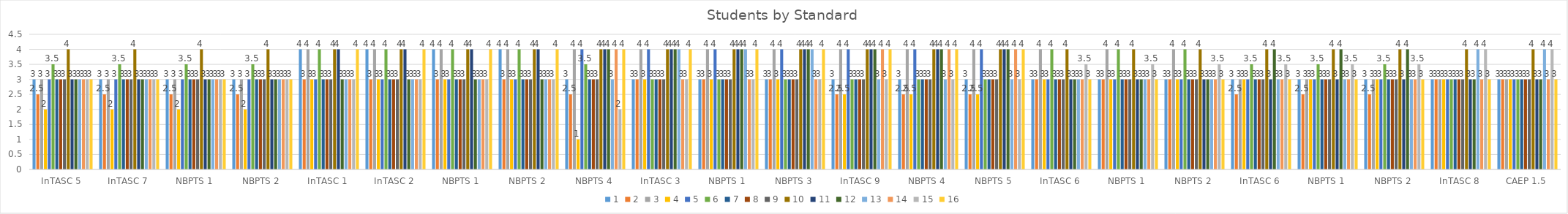
| Category | 1 | 2 | 3 | 4 | 5 | 6 | 7 | 8 | 9 | 10 | 11 | 12 | 13 | 14 | 15 | 16 |
|---|---|---|---|---|---|---|---|---|---|---|---|---|---|---|---|---|
| InTASC 5 | 3 | 2.5 | 3 | 2 | 3 | 3.5 | 3 | 3 | 3 | 4 | 3 | 3 | 3 | 3 | 3 | 3 |
| InTASC 7 | 3 | 2.5 | 3 | 2 | 3 | 3.5 | 3 | 3 | 3 | 4 | 3 | 3 | 3 | 3 | 3 | 3 |
| NBPTS 1 | 3 | 2.5 | 3 | 2 | 3 | 3.5 | 3 | 3 | 3 | 4 | 3 | 3 | 3 | 3 | 3 | 3 |
| NBPTS 2 | 3 | 2.5 | 3 | 2 | 3 | 3.5 | 3 | 3 | 3 | 4 | 3 | 3 | 3 | 3 | 3 | 3 |
| InTASC 1 | 4 | 3 | 4 | 3 | 3 | 4 | 3 | 3 | 3 | 4 | 4 | 3 | 3 | 3 | 3 | 4 |
| InTASC 2 | 4 | 3 | 4 | 3 | 3 | 4 | 3 | 3 | 3 | 4 | 4 | 3 | 3 | 3 | 3 | 4 |
| NBPTS 1 | 4 | 3 | 4 | 3 | 3 | 4 | 3 | 3 | 3 | 4 | 4 | 3 | 3 | 3 | 3 | 4 |
| NBPTS 2 | 4 | 3 | 4 | 3 | 3 | 4 | 3 | 3 | 3 | 4 | 4 | 3 | 3 | 3 | 3 | 4 |
| NBPTS 4 | 3 | 2.5 | 4 | 1 | 4 | 3.5 | 3 | 3 | 3 | 4 | 4 | 4 | 3 | 4 | 2 | 4 |
| InTASC 3 | 3 | 3 | 4 | 3 | 4 | 3 | 3 | 3 | 3 | 4 | 4 | 4 | 4 | 3 | 3 | 4 |
| NBPTS 1 | 3 | 3 | 4 | 3 | 4 | 3 | 3 | 3 | 3 | 4 | 4 | 4 | 4 | 3 | 3 | 4 |
| NBPTS 3 | 3 | 3 | 4 | 3 | 4 | 3 | 3 | 3 | 3 | 4 | 4 | 4 | 4 | 3 | 3 | 4 |
| InTASC 9 | 3 | 2.5 | 4 | 2.5 | 4 | 3 | 3 | 3 | 3 | 4 | 4 | 4 | 3 | 4 | 3 | 4 |
| NBPTS 4 | 3 | 2.5 | 4 | 2.5 | 4 | 3 | 3 | 3 | 3 | 4 | 4 | 4 | 3 | 4 | 3 | 4 |
| NBPTS 5 | 3 | 2.5 | 4 | 2.5 | 4 | 3 | 3 | 3 | 3 | 4 | 4 | 4 | 3 | 4 | 3 | 4 |
| InTASC 6 | 3 | 3 | 4 | 3 | 3 | 4 | 3 | 3 | 3 | 4 | 3 | 3 | 3 | 3 | 3.5 | 3 |
| NBPTS 1 | 3 | 3 | 4 | 3 | 3 | 4 | 3 | 3 | 3 | 4 | 3 | 3 | 3 | 3 | 3.5 | 3 |
| NBPTS 2 | 3 | 3 | 4 | 3 | 3 | 4 | 3 | 3 | 3 | 4 | 3 | 3 | 3 | 3 | 3.5 | 3 |
| InTASC 6 | 3 | 2.5 | 3 | 3 | 3 | 3.5 | 3 | 3 | 3 | 4 | 3 | 4 | 3 | 3 | 3.5 | 3 |
| NBPTS 1 | 3 | 2.5 | 3 | 3 | 3 | 3.5 | 3 | 3 | 3 | 4 | 3 | 4 | 3 | 3 | 3.5 | 3 |
| NBPTS 2 | 3 | 2.5 | 3 | 3 | 3 | 3.5 | 3 | 3 | 3 | 4 | 3 | 4 | 3 | 3 | 3.5 | 3 |
| InTASC 8 | 3 | 3 | 3 | 3 | 3 | 3 | 3 | 3 | 3 | 4 | 3 | 3 | 4 | 3 | 4 | 3 |
| CAEP 1.5 | 3 | 3 | 3 | 3 | 3 | 3 | 3 | 3 | 3 | 4 | 3 | 3 | 4 | 3 | 4 | 3 |